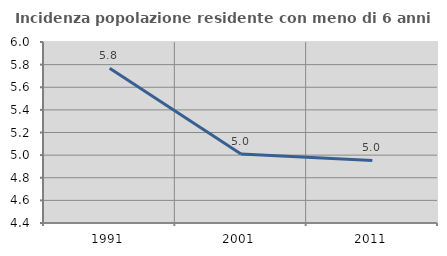
| Category | Incidenza popolazione residente con meno di 6 anni |
|---|---|
| 1991.0 | 5.767 |
| 2001.0 | 5.009 |
| 2011.0 | 4.953 |